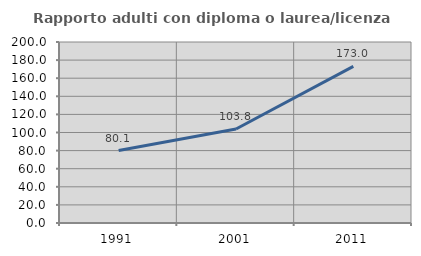
| Category | Rapporto adulti con diploma o laurea/licenza media  |
|---|---|
| 1991.0 | 80.071 |
| 2001.0 | 103.835 |
| 2011.0 | 173.038 |